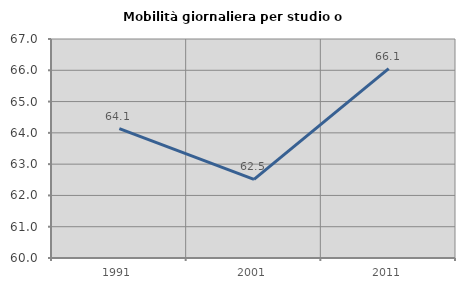
| Category | Mobilità giornaliera per studio o lavoro |
|---|---|
| 1991.0 | 64.136 |
| 2001.0 | 62.511 |
| 2011.0 | 66.054 |